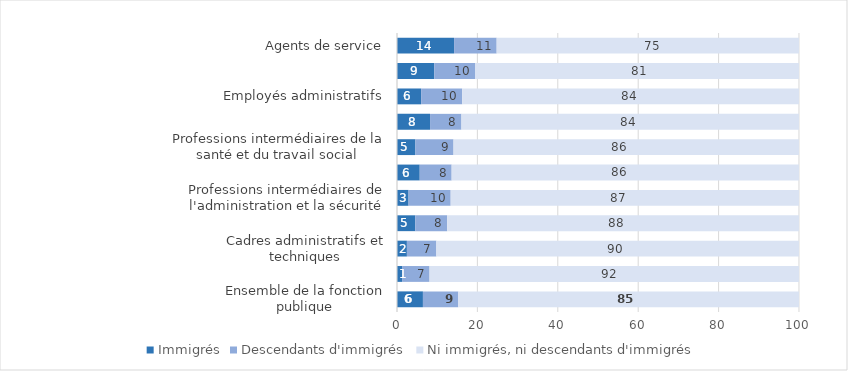
| Category | Immigrés | Descendants d'immigrés | Ni immigrés, ni descendants d'immigrés |
|---|---|---|---|
| Ensemble de la fonction publique | 6.451 | 8.798 | 84.752 |
| Policiers, militaires, pompiers | 1.262 | 6.831 | 91.907 |
| Cadres administratifs et techniques | 2.463 | 7.327 | 90.21 |
| Professions de l’enseignement primaire et professionnel,de la formation continue et sport | 4.546 | 7.929 | 87.525 |
| Professions intermédiaires de l'administration et la sécurité | 2.877 | 10.476 | 86.647 |
| Ouvriers | 5.655 | 7.939 | 86.407 |
| Professions intermédiaires de la santé et du travail social | 4.584 | 9.476 | 85.94 |
| Professions de l’enseignement secondaire, du supérieur et de la recherche  | 8.223 | 7.807 | 83.97 |
| Employés administratifs | 6.007 | 10.199 | 83.793 |
| Aides-soignants, petite enfance et professions assimilées | 9.268 | 10.136 | 80.597 |
| Agents de service | 14.203 | 10.587 | 75.21 |